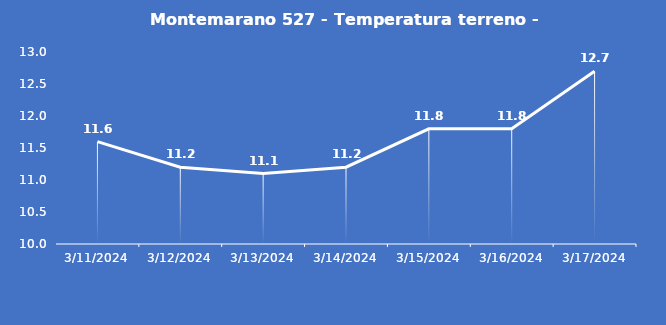
| Category | Montemarano 527 - Temperatura terreno - Grezzo (°C) |
|---|---|
| 3/11/24 | 11.6 |
| 3/12/24 | 11.2 |
| 3/13/24 | 11.1 |
| 3/14/24 | 11.2 |
| 3/15/24 | 11.8 |
| 3/16/24 | 11.8 |
| 3/17/24 | 12.7 |